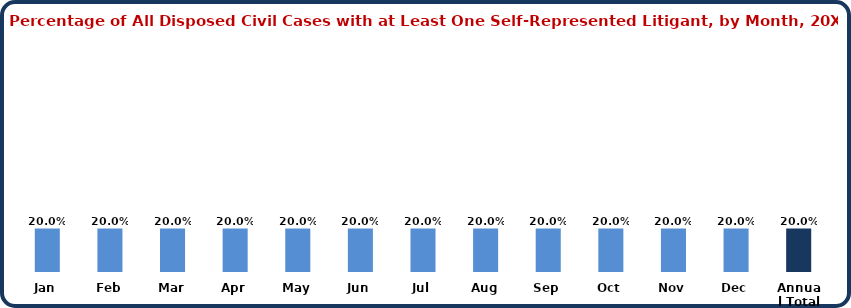
| Category | Civil |
|---|---|
| Jan | 0.2 |
| Feb | 0.2 |
| Mar | 0.2 |
| Apr | 0.2 |
| May | 0.2 |
| Jun | 0.2 |
| Jul | 0.2 |
| Aug | 0.2 |
| Sep | 0.2 |
| Oct | 0.2 |
| Nov | 0.2 |
| Dec | 0.2 |
| Annual Total | 0.2 |